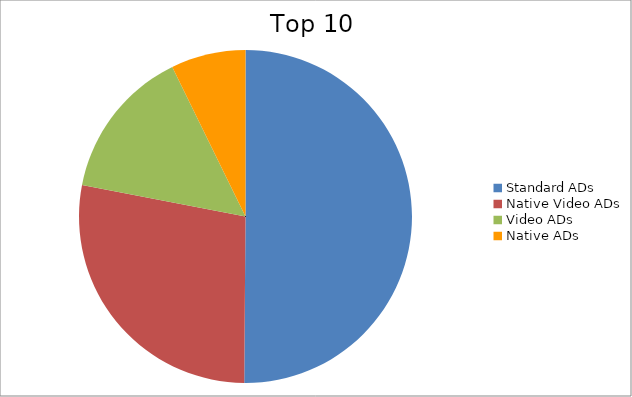
| Category | Series 0 |
|---|---|
| Standard ADs | 50.12 |
| Native Video ADs | 27.92 |
| Video ADs | 14.71 |
| Native ADs | 7.25 |